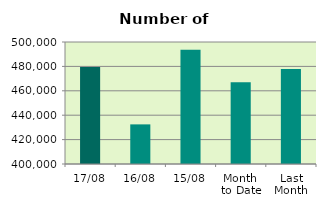
| Category | Series 0 |
|---|---|
| 17/08 | 479436 |
| 16/08 | 432476 |
| 15/08 | 493608 |
| Month 
to Date | 466925.385 |
| Last
Month | 477777.545 |